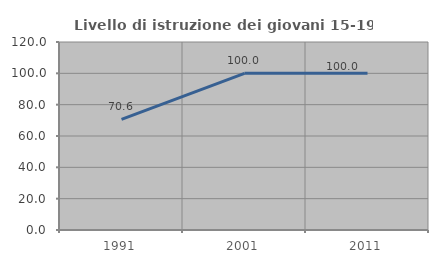
| Category | Livello di istruzione dei giovani 15-19 anni |
|---|---|
| 1991.0 | 70.588 |
| 2001.0 | 100 |
| 2011.0 | 100 |